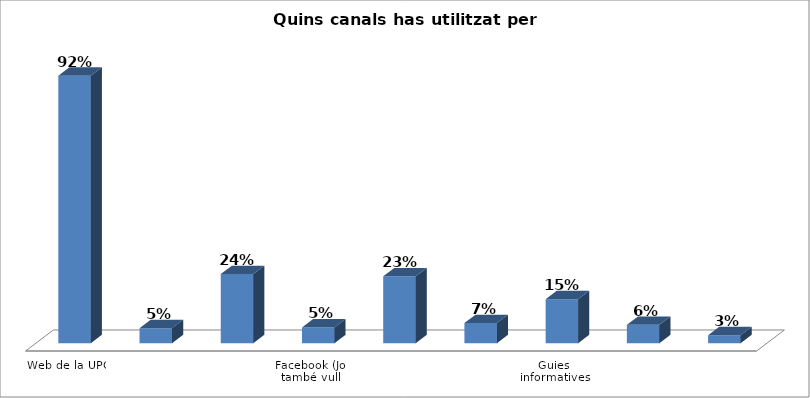
| Category | Series 0 |
|---|---|
| Web de la UPC | 0.923 |
| Portal d’activitats d’Informació i orientació per a l'estudiantat de secundària del web de la UPC | 0.052 |
| Web de les escoles i facultats de la UPC | 0.239 |
| Facebook (Jo també vull estudiar a la UPC) | 0.054 |
| Cercadors (Google, Yahoo, altres) | 0.231 |
| Portals educatius | 0.069 |
| Guies informatives dels estudis de la UPC | 0.152 |
| Consultes al servei d'informació de la UPC | 0.063 |
| Altres | 0.028 |